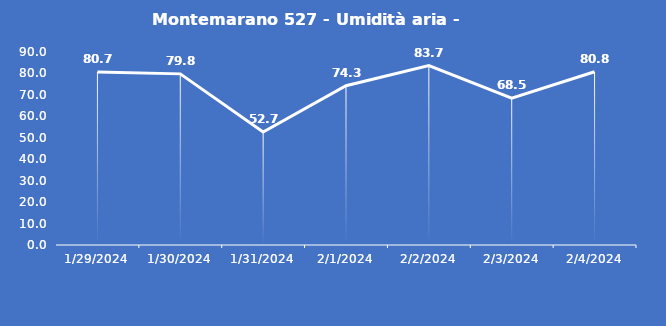
| Category | Montemarano 527 - Umidità aria - Grezzo (%) |
|---|---|
| 1/29/24 | 80.7 |
| 1/30/24 | 79.8 |
| 1/31/24 | 52.7 |
| 2/1/24 | 74.3 |
| 2/2/24 | 83.7 |
| 2/3/24 | 68.5 |
| 2/4/24 | 80.8 |